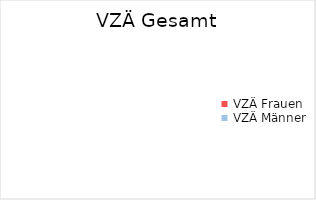
| Category | Gesamt | Stellvertretung (PL) | Projektmitarbeit (wissenschaftlich) | Projektmitarbeit (technisch) | Projektmitarbeit (administrativ) |
|---|---|---|---|---|---|
| VZÄ Frauen | 0 | 0 | 0 | 0 | 0 |
| VZÄ Männer | 0 | 0 | 0 | 0 | 0 |